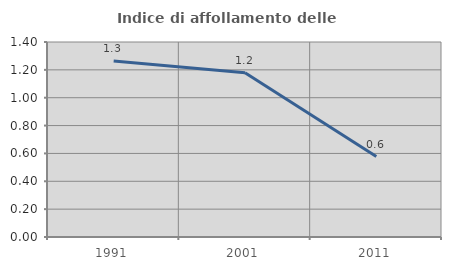
| Category | Indice di affollamento delle abitazioni  |
|---|---|
| 1991.0 | 1.264 |
| 2001.0 | 1.18 |
| 2011.0 | 0.577 |